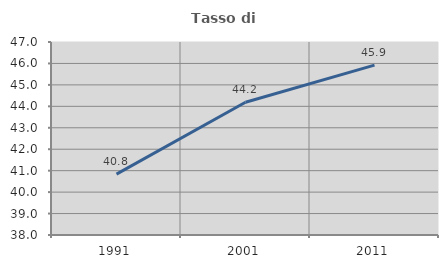
| Category | Tasso di occupazione   |
|---|---|
| 1991.0 | 40.84 |
| 2001.0 | 44.192 |
| 2011.0 | 45.919 |